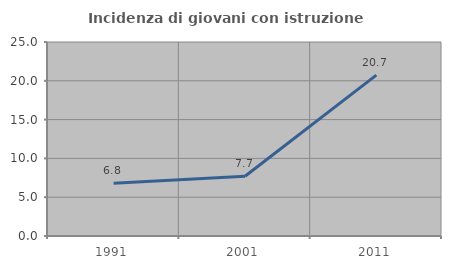
| Category | Incidenza di giovani con istruzione universitaria |
|---|---|
| 1991.0 | 6.81 |
| 2001.0 | 7.706 |
| 2011.0 | 20.724 |